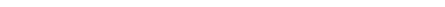
| Category | budget | end of year projected spend |
|---|---|---|
| 0 | 1 | 1 |